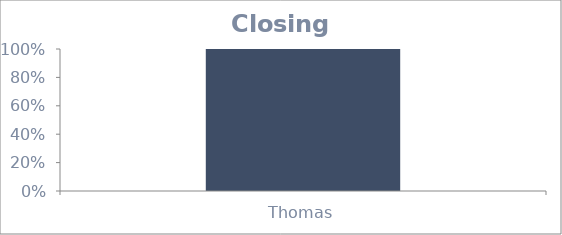
| Category | Closing % |
|---|---|
| Thomas | 1 |
| Laura | 0.667 |
| Michael | 1 |
| Donna | 0.333 |
| Susan | 1 |
| Samantha | 0 |
| John | 0 |